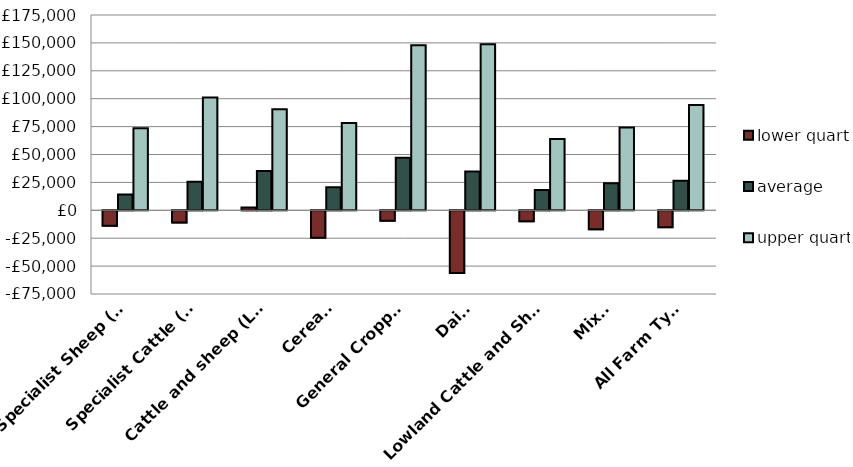
| Category | lower quartile | average | upper quartile |
|---|---|---|---|
| Specialist Sheep (LFA) | -13879.8 | 14047.6 | 73529.2 |
| Specialist Cattle (LFA) | -11019.8 | 25564.7 | 101007.9 |
| Cattle and sheep (LFA) | 2571.6 | 35284.3 | 90655.8 |
| Cereals | -24680.1 | 20589.2 | 78118.1 |
| General Cropping | -9346.7 | 47079.7 | 147893.1 |
| Dairy | -56134.3 | 34696 | 148880.1 |
| Lowland Cattle and Sheep | -9852.7 | 18252.3 | 63993.4 |
| Mixed | -17052.7 | 24167.6 | 74200.4 |
| All Farm Types | -15102.2 | 26402.3 | 94376.1 |